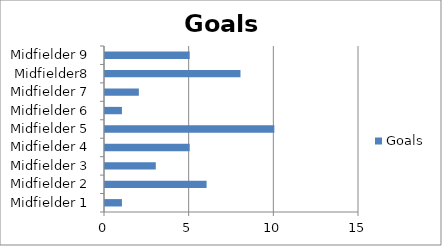
| Category | Goals |
|---|---|
| Midfielder 1 | 1 |
| Midfielder 2 | 6 |
| Midfielder 3 | 3 |
| Midfielder 4 | 5 |
| Midfielder 5 | 10 |
| Midfielder 6 | 1 |
| Midfielder 7 | 2 |
| Midfielder8 | 8 |
| Midfielder 9 | 5 |